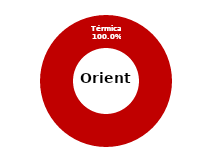
| Category | Oriente |
|---|---|
| Eólica | 0 |
| Hidráulica | 0 |
| Solar | 0 |
| Térmica | 37.093 |